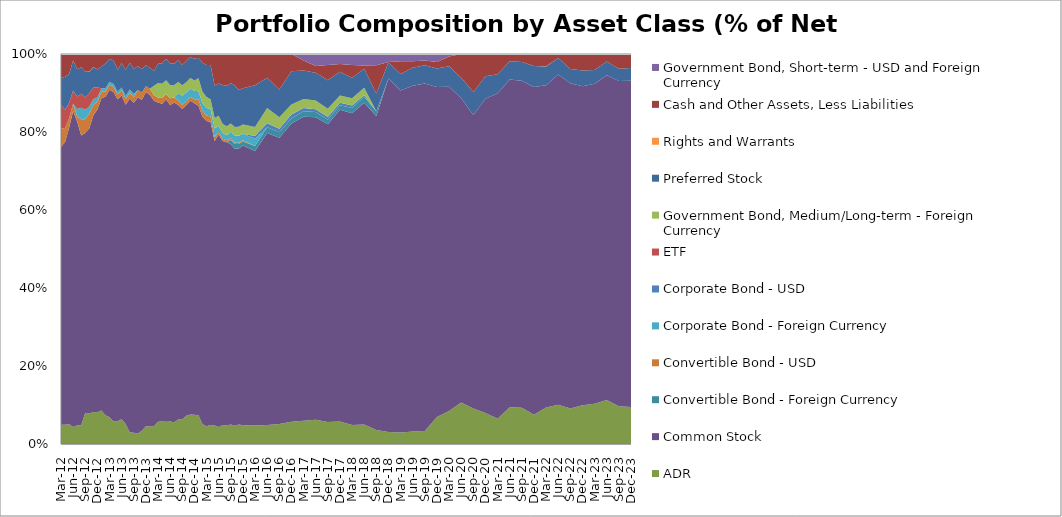
| Category | ADR | Common Stock | Convertible Bond - Foreign Currency | Convertible Bond - USD | Corporate Bond - Foreign Currency | Corporate Bond - USD | ETF | Government Bond, Medium/Long-term - Foreign Currency | Preferred Stock | Rights and Warrants | Cash and Other Assets, Less Liabilities | Government Bond, Short-term - USD and Foreign Currency |
|---|---|---|---|---|---|---|---|---|---|---|---|---|
| 2012-03-31 | 4.955 | 71.205 | 0 | 4.642 | 0 | 0 | 6.188 | 0 | 6.887 | 0 | 6.123 | 0 |
| 2012-04-30 | 4.95 | 72.48 | 0 | 3.56 | 0 | 0 | 4.71 | 0 | 8.44 | 0 | 5.84 | 0 |
| 2012-05-31 | 5.12 | 75.94 | 0 | 2.39 | 0 | 0 | 4.01 | 0 | 7.39 | 0 | 5.15 | 0 |
| 2012-06-30 | 4.38 | 80.98 | 0 | 1.86 | 0 | 0 | 3.39 | 0 | 7.71 | 0.03 | 1.65 | 0 |
| 2012-07-31 | 4.78 | 77.92 | 0 | 1.29 | 1.88 | 0 | 3.24 | 0 | 6.97 | 0.03 | 3.89 | 0 |
| 2012-08-31 | 4.8 | 74.31 | 0 | 4.19 | 2.92 | 0 | 3.56 | 0 | 6.8 | 0.03 | 3.39 | 0 |
| 2012-09-30 | 8.01 | 71.74 | 0 | 3.49 | 2.44 | 0 | 3.24 | 0 | 6.51 | 0.02 | 4.55 | 0 |
| 2012-10-31 | 7.83 | 73.12 | 0 | 3.77 | 1.81 | 0 | 3.4 | 0 | 5.55 | 0.01 | 4.51 | 0 |
| 2012-11-30 | 8.21 | 76.09 | 0 | 2.71 | 1.42 | 0 | 3.01 | 0 | 5.19 | 0.01 | 3.36 | 0 |
| 2012-12-31 | 8.17 | 77.58 | 0 | 2 | 1.12 | 0 | 2.59 | 0 | 4.57 | 0.01 | 3.96 | 0 |
| 2013-01-31 | 8.62 | 80.01 | 0 | 1.66 | 0.84 | 0 | 0 | 0 | 5.67 | 0.02 | 3.18 | 0 |
| 2013-02-28 | 7.36 | 81.67 | 0 | 1.38 | 0.84 | 0 | 0 | 0 | 6.32 | 0.01 | 2.42 | 0 |
| 2013-03-31 | 6.89 | 83.92 | 0 | 1.31 | 0.77 | 0 | 0 | 0 | 5.83 | 0.01 | 1.27 | 0 |
| 2013-04-30 | 5.78 | 84.48 | 0 | 1.3 | 0.75 | 0 | 0 | 0 | 6.01 | 0.01 | 1.67 | 0 |
| 2013-05-31 | 5.87 | 82.54 | 0 | 1.26 | 0.65 | 0 | 0 | 0 | 5.66 | 0.01 | 4.01 | 0 |
| 2013-06-30 | 6.37 | 82.99 | 0 | 1.35 | 0.72 | 0 | 0 | 0 | 6.25 | 0.01 | 2.31 | 0 |
| 2013-07-31 | 5.13 | 81.85 | 0 | 1.47 | 0.77 | 0 | 0 | 0 | 6.76 | 0 | 4.02 | 0 |
| 2013-08-31 | 3.01 | 85.55 | 0 | 1.51 | 0.82 | 0 | 0 | 0 | 6.87 | 0 | 2.24 | 0 |
| 2013-09-30 | 2.89 | 84.6 | 0 | 1.4 | 0.88 | 0 | 0 | 0 | 6.43 | 0 | 3.8 | 0 |
| 2013-10-31 | 2.68 | 86.17 | 0 | 1.92 | 0 | 0 | 0 | 0 | 6.1 | 0 | 3.12 | 0 |
| 2013-11-30 | 3.38 | 84.87 | 0 | 1.89 | 0 | 0 | 0 | 0 | 6 | 0 | 3.86 | 0 |
| 2013-12-31 | 4.54 | 85.72 | 0 | 1.44 | 0 | 0 | 0 | 0 | 5.44 | 0 | 2.86 | 0 |
| 2014-01-31 | 4.46 | 85.02 | 0 | 1.58 | 0 | 0 | 0 | 0 | 5.41 | 0 | 3.53 | 0 |
| 2014-02-28 | 4.55 | 83.44 | 0 | 1.42 | 0 | 0 | 0 | 2.45 | 3.78 | 0 | 4.33 | 0 |
| 2014-03-31 | 5.687 | 81.905 | 0 | 1.247 | 0 | 0 | 0 | 3.749 | 4.909 | 0 | 2.503 | 0 |
| 2014-04-30 | 5.79 | 81.47 | 0 | 1.46 | 0 | 0 | 0 | 3.63 | 5.3 | 0 | 2.35 | 0 |
| 2014-05-31 | 5.7 | 82.65 | 0 | 1.42 | 0 | 0 | 0 | 3.52 | 5.46 | 0 | 1.25 | 0 |
| 2014-06-30 | 5.78 | 81.17 | 0 | 1.69 | 0 | 0 | 0 | 3.39 | 5.51 | 0 | 2.46 | 0 |
| 2014-07-31 | 5.55 | 82.02 | 0 | 1.28 | 0 | 0 | 0 | 3.17 | 5.54 | 0 | 2.44 | 0 |
| 2014-08-31 | 6.25 | 80.69 | 0 | 1.17 | 1.89 | 0 | 0 | 2.84 | 5.54 | 0 | 1.614 | 0 |
| 2014-09-30 | 6.29 | 79.61 | 0 | 1.1 | 2.28 | 0 | 0 | 2.7 | 5.23 | 0 | 2.79 | 0 |
| 2014-10-31 | 7.25 | 79.63 | 0 | 1.01 | 2.22 | 0 | 0 | 2.63 | 5.44 | 0 | 1.82 | 0 |
| 2014-11-30 | 7.59 | 80.4 | 0 | 1.01 | 2.16 | 0 | 0 | 2.69 | 5.39 | 0 | 0.76 | 0 |
| 2014-12-31 | 7.48 | 79.88 | 0 | 1.04 | 2.18 | 0 | 0 | 2.61 | 5.61 | 0 | 1.2 | 0 |
| 2015-01-31 | 7.4 | 79.36 | 0 | 1.64 | 2.06 | 0 | 0 | 3.31 | 5.25 | 0 | 0.98 | 0 |
| 2015-02-28 | 5.08 | 78.82 | 0 | 1.52 | 2 | 0 | 0 | 2.91 | 7.42 | 0 | 2.25 | 0 |
| 2015-03-31 | 4.52 | 78.3 | 0 | 1.42 | 1.89 | 0 | 0 | 2.82 | 8.2 | 0 | 2.85 | 0 |
| 2015-04-30 | 4.9 | 77.65 | 0 | 1.45 | 1.92 | 0 | 0 | 2.5 | 8.74 | 0 | 2.84 | 0 |
| 2015-05-31 | 4.77 | 72.92 | 0 | 1.02 | 2.2 | 0 | 0 | 2.7 | 8.34 | 0 | 8.05 | 0 |
| 2015-06-30 | 4.33 | 75.01 | 0 | 0.72 | 1.55 | 0 | 0 | 2.53 | 8.32 | 0 | 7.54 | 0 |
| 2015-07-31 | 4.84 | 72.85 | 0 | 0.56 | 1.47 | 0 | 0 | 2.32 | 9.98 | 0 | 7.98 | 0 |
| 2015-08-31 | 4.72 | 72.63 | 0 | 0.51 | 1.3 | 0 | 0 | 2.3 | 10.42 | 0 | 8.12 | 0 |
| 2015-09-30 | 5.03 | 71.8 | 1.1 | 0.44 | 1.65 | 0 | 0 | 2.15 | 10.33 | 0 | 7.5 | 0 |
| 2015-10-31 | 4.7 | 71.02 | 1.18 | 0.37 | 1.84 | 0 | 0 | 2.17 | 10.64 | 0 | 8.08 | 0 |
| 2015-11-30 | 5 | 70.74 | 1.16 | 0.35 | 1.79 | 0 | 0 | 2.32 | 9.4 | 0 | 9.24 | 0 |
| 2015-12-31 | 4.82 | 71.69 | 1.04 | 0.33 | 1.66 | 0 | 0 | 2.38 | 9.27 | 0 | 8.81 | 0 |
| 2016-03-31 | 4.76 | 70.37 | 1.29 | 0 | 1.82 | 0.71 | 0 | 2.32 | 10.69 | 0 | 8.04 | 0 |
| 2016-06-30 | 4.84 | 74.88 | 1.47 | 0 | 0 | 1.04 | 0 | 3.91 | 7.77 | 0 | 6.09 | 0 |
| 2016-09-30 | 5.14 | 73.39 | 1.38 | 0 | 0 | 0.93 | 0 | 2.94 | 7.11 | 0 | 9.11 | 0 |
| 2016-12-31 | 5.69 | 76.51 | 1.27 | 0 | 0 | 0.99 | 0 | 2.57 | 8.54 | 0 | 4.43 | 0 |
| 2017-03-31 | 5.93 | 77.95 | 1.44 | 0 | 0 | 0.83 | 0 | 2.34 | 7.26 | 0 | 2.59 | 1.66 |
| 2017-06-30 | 6.21 | 77.6 | 1.29 | 0 | 0 | 0.75 | 0 | 2.2 | 7.14 | 0 | 1.72 | 3.09 |
| 2017-09-30 | 5.63 | 76.35 | 1.17 | 0 | 0 | 0.7 | 0 | 2.13 | 7.28 | 0 | 3.93 | 2.81 |
| 2017-12-31 | 5.78 | 79.95 | 1.1 | 0 | 0 | 0.65 | 0 | 1.87 | 6.1 | 0 | 2.01 | 2.54 |
| 2018-03-31 | 4.84 | 79.98 | 1.33 | 0 | 0 | 0.62 | 0 | 1.87 | 5.28 | 0 | 3.26 | 2.82 |
| 2018-06-30 | 4.98 | 82.54 | 1.51 | 0 | 0 | 0.38 | 0 | 1.91 | 4.92 | 0 | 0.83 | 2.93 |
| 2018-09-30 | 3.61 | 80.5 | 1.19 | 0 | 0 | 0 | 0 | 0 | 4.55 | 0 | 7.29 | 2.86 |
| 2018-12-31 | 3.06 | 90.67 | 0 | 0 | 0 | 0 | 0 | 0 | 4.08 | 0 | 0.12 | 2.07 |
| 2019-03-31 | 2.97 | 87.68 | 0 | 0 | 0 | 0 | 0 | 0 | 4.23 | 0 | 3.24 | 1.88 |
| 2019-06-30 | 3.2 | 88.65 | 0 | 0 | 0 | 0 | 0 | 0 | 4.6 | 0 | 1.71 | 1.84 |
| 2019-09-30 | 3.36 | 89.09 | 0 | 0 | 0 | 0 | 0 | 0 | 4.67 | 0 | 1.24 | 1.64 |
| 2019-12-31 | 6.95 | 84.59 | 0 | 0 | 0 | 0 | 0 | 0 | 4.77 | 0 | 1.62 | 2.07 |
| 2020-03-31 | 8.46 | 83.14 | 0 | 0 | 0 | 0 | 0 | 0 | 5.24 | 0 | 2.52 | 0.64 |
| 2020-06-30 | 10.65 | 78.02 | 0 | 0 | 0 | 0 | 0 | 0 | 5.26 | 0 | 6.07 | 0 |
| 2020-09-30 | 9.08 | 75.27 | 0 | 0 | 0 | 0 | 0 | 0 | 5.92 | 0 | 9.73 | 0 |
| 2020-12-31 | 7.93 | 80.57 | 0 | 0 | 0 | 0 | 0 | 0 | 5.8 | 0 | 5.7 | 0 |
| 2021-03-31 | 6.45 | 83.46 | 0 | 0 | 0 | 0 | 0 | 0 | 4.88 | 0 | 5.21 | 0 |
| 2021-06-30 | 9.41 | 84.05 | 0 | 0 | 0 | 0 | 0 | 0 | 4.68 | 0 | 1.86 | 0 |
| 2021-09-30 | 9.29 | 83.86 | 0 | 0 | 0 | 0 | 0 | 0 | 4.8 | 0 | 2.05 | 0 |
| 2021-12-31 | 7.5 | 84.05 | 0 | 0 | 0 | 0 | 0 | 0 | 5.39 | 0 | 3.06 | 0 |
| 2022-03-31 | 9.36 | 82.61 | 0 | 0 | 0 | 0 | 0 | 0 | 4.85 | 0.07 | 3.11 | 0 |
| 2022-06-30 | 10.04 | 84.71 | 0 | 0 | 0 | 0 | 0 | 0 | 4.21 | 0 | 1.04 | 0 |
| 2022-09-30 | 9.12 | 83.37 | 0 | 0 | 0 | 0 | 0 | 0 | 3.64 | 0 | 3.87 | 0 |
| 2022-12-31 | 9.93 | 81.83 | 0 | 0 | 0 | 0 | 0 | 0 | 4.03 | 0 | 4.21 | 0 |
| 2023-03-31 | 10.33 | 82.05 | 0 | 0 | 0 | 0 | 0 | 0 | 3.54 | 0 | 4.08 | 0 |
| 2023-06-30 | 11.3 | 83.27 | 0 | 0 | 0 | 0 | 0 | 0 | 3.49 | 0 | 1.94 | 0 |
| 2023-09-30 | 9.65 | 83.45 | 0 | 0 | 0 | 0 | 0 | 0 | 3.09 | 0 | 3.81 | 0 |
| 2023-12-31 | 9.49 | 83.68 | 0 | 0 | 0 | 0 | 0 | 0 | 3.25 | 0 | 3.58 | 0 |